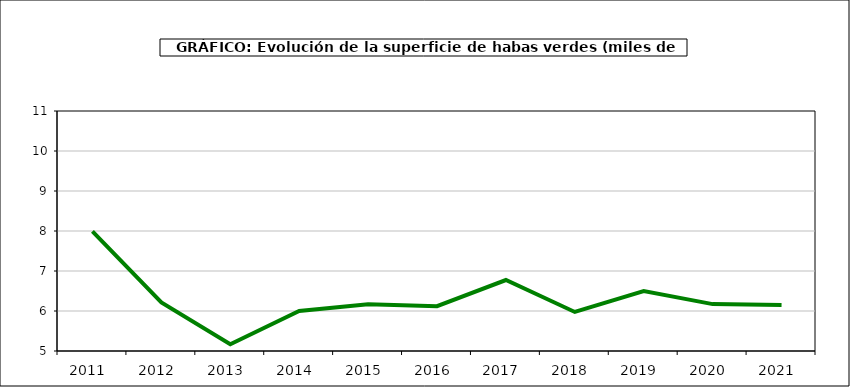
| Category | superficie |
|---|---|
| 2011.0 | 7.993 |
| 2012.0 | 6.216 |
| 2013.0 | 5.17 |
| 2014.0 | 6.001 |
| 2015.0 | 6.169 |
| 2016.0 | 6.119 |
| 2017.0 | 6.774 |
| 2018.0 | 5.976 |
| 2019.0 | 6.497 |
| 2020.0 | 6.172 |
| 2021.0 | 6.147 |